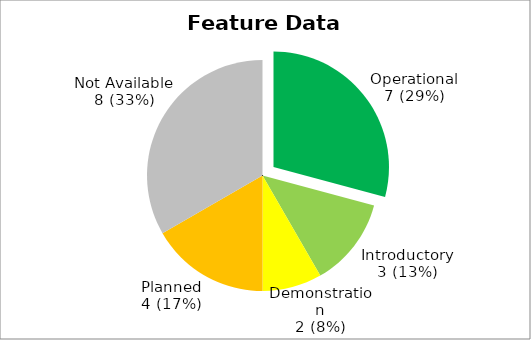
| Category | Series 0 |
|---|---|
| Operational? | 7 |
| Introductory? | 3 |
| Demonstration? | 2 |
| Planned? | 4 |
| Not Available? | 8 |